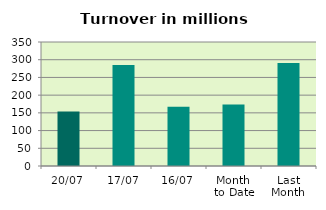
| Category | Series 0 |
|---|---|
| 20/07 | 153.806 |
| 17/07 | 285.305 |
| 16/07 | 167.138 |
| Month 
to Date | 173.694 |
| Last
Month | 290.981 |